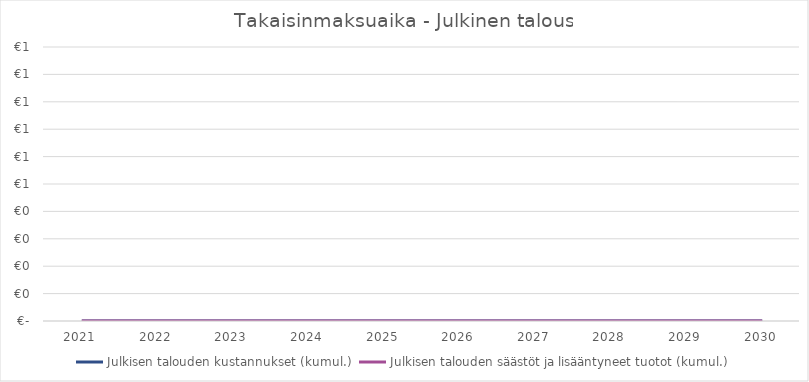
| Category | Julkisen talouden kustannukset (kumul.) | Julkisen talouden säästöt ja lisääntyneet tuotot (kumul.) |
|---|---|---|
| 2021.0 | 0 | 0 |
| 2022.0 | 0 | 0 |
| 2023.0 | 0 | 0 |
| 2024.0 | 0 | 0 |
| 2025.0 | 0 | 0 |
| 2026.0 | 0 | 0 |
| 2027.0 | 0 | 0 |
| 2028.0 | 0 | 0 |
| 2029.0 | 0 | 0 |
| 2030.0 | 0 | 0 |